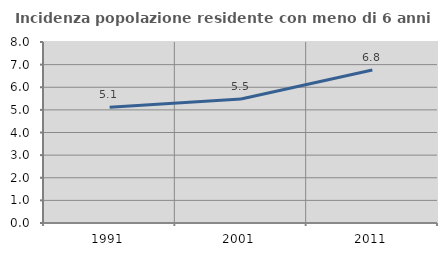
| Category | Incidenza popolazione residente con meno di 6 anni |
|---|---|
| 1991.0 | 5.117 |
| 2001.0 | 5.479 |
| 2011.0 | 6.759 |